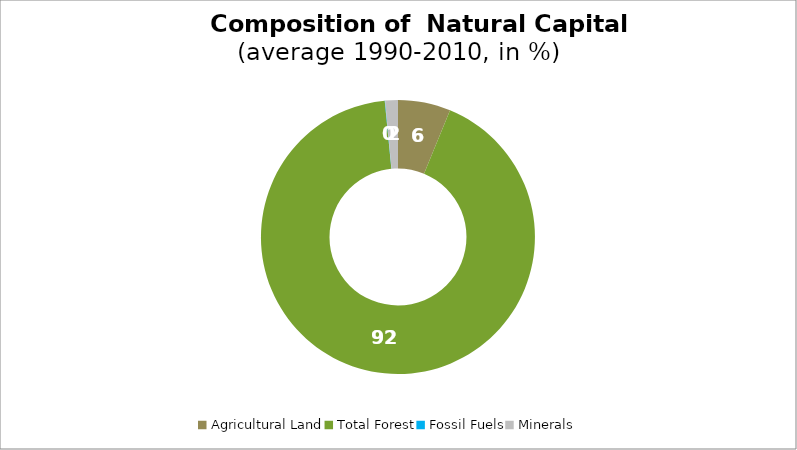
| Category | Series 0 |
|---|---|
| Agricultural Land | 6.202 |
| Total Forest | 92.252 |
| Fossil Fuels | 0.046 |
| Minerals | 1.501 |